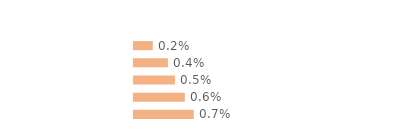
| Category | Series 0 |
|---|---|
| Communes rurales | 0.002 |
| moins de 20 000 hab. | 0.004 |
| 20 000 - 100 000 hab. | 0.005 |
| 100 000 hab. ou plus | 0.006 |
| Agglomération parisienne | 0.007 |